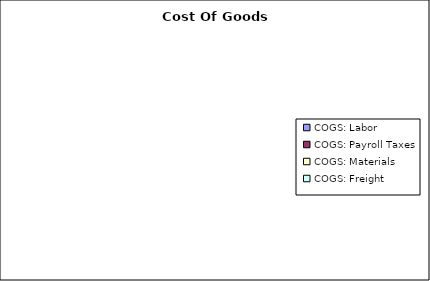
| Category | Series 0 |
|---|---|
| COGS: Labor | 0 |
| COGS: Payroll Taxes | 0 |
| COGS: Materials | 0 |
| COGS: Freight | 0 |